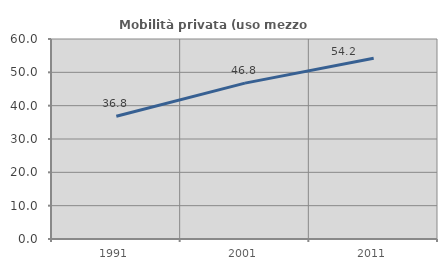
| Category | Mobilità privata (uso mezzo privato) |
|---|---|
| 1991.0 | 36.845 |
| 2001.0 | 46.767 |
| 2011.0 | 54.228 |